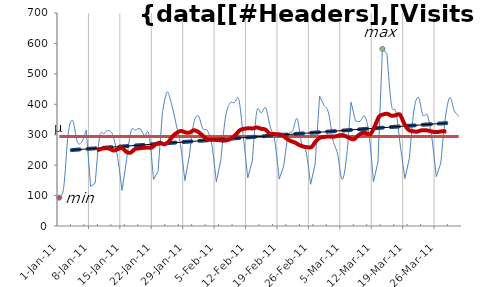
| Category | Visits | μ |
|---|---|---|
| 2011-01-01 | 93 | 293.9 |
| 2011-01-02 | 127 | 293.9 |
| 2011-01-03 | 304 | 293.9 |
| 2011-01-04 | 347 | 293.9 |
| 2011-01-05 | 277 | 293.9 |
| 2011-01-06 | 275 | 293.9 |
| 2011-01-07 | 315 | 293.9 |
| 2011-01-08 | 130 | 293.9 |
| 2011-01-09 | 141 | 293.9 |
| 2011-01-10 | 293 | 293.9 |
| 2011-01-11 | 304 | 293.9 |
| 2011-01-12 | 314 | 293.9 |
| 2011-01-13 | 296 | 293.9 |
| 2011-01-14 | 225 | 293.9 |
| 2011-01-15 | 117 | 293.9 |
| 2011-01-16 | 218 | 293.9 |
| 2011-01-17 | 313 | 293.9 |
| 2011-01-18 | 315 | 293.9 |
| 2011-01-19 | 320 | 293.9 |
| 2011-01-20 | 297 | 293.9 |
| 2011-01-21 | 301 | 293.9 |
| 2011-01-22 | 153 | 293.9 |
| 2011-01-23 | 179 | 293.9 |
| 2011-01-24 | 375 | 293.9 |
| 2011-01-25 | 440 | 293.9 |
| 2011-01-26 | 402 | 293.9 |
| 2011-01-27 | 337 | 293.9 |
| 2011-01-28 | 267 | 293.9 |
| 2011-01-29 | 149 | 293.9 |
| 2011-01-30 | 233 | 293.9 |
| 2011-01-31 | 340 | 293.9 |
| 2011-02-01 | 361 | 293.9 |
| 2011-02-02 | 319 | 293.9 |
| 2011-02-03 | 314 | 293.9 |
| 2011-02-04 | 266 | 293.9 |
| 2011-02-05 | 145 | 293.9 |
| 2011-02-06 | 218 | 293.9 |
| 2011-02-07 | 354 | 293.9 |
| 2011-02-08 | 403 | 293.9 |
| 2011-02-09 | 405 | 293.9 |
| 2011-02-10 | 416 | 293.9 |
| 2011-02-11 | 295 | 293.9 |
| 2011-02-12 | 158 | 293.9 |
| 2011-02-13 | 214 | 293.9 |
| 2011-02-14 | 376 | 293.9 |
| 2011-02-15 | 372 | 293.9 |
| 2011-02-16 | 388 | 293.9 |
| 2011-02-17 | 326 | 293.9 |
| 2011-02-18 | 281 | 293.9 |
| 2011-02-19 | 154 | 293.9 |
| 2011-02-20 | 197 | 293.9 |
| 2011-02-21 | 297 | 293.9 |
| 2011-02-22 | 313 | 293.9 |
| 2011-02-23 | 353 | 293.9 |
| 2011-02-24 | 272 | 293.9 |
| 2011-02-25 | 243 | 293.9 |
| 2011-02-26 | 137 | 293.9 |
| 2011-02-27 | 203 | 293.9 |
| 2011-02-28 | 427 | 293.9 |
| 2011-03-01 | 396 | 293.9 |
| 2011-03-02 | 371 | 293.9 |
| 2011-03-03 | 282 | 293.9 |
| 2011-03-04 | 237 | 293.9 |
| 2011-03-05 | 153 | 293.9 |
| 2011-03-06 | 226 | 293.9 |
| 2011-03-07 | 407 | 293.9 |
| 2011-03-08 | 345 | 293.9 |
| 2011-03-09 | 344 | 293.9 |
| 2011-03-10 | 361 | 293.9 |
| 2011-03-11 | 305 | 293.9 |
| 2011-03-12 | 145 | 293.9 |
| 2011-03-13 | 210 | 293.9 |
| 2011-03-14 | 582 | 293.9 |
| 2011-03-15 | 566 | 293.9 |
| 2011-03-16 | 397 | 293.9 |
| 2011-03-17 | 375 | 293.9 |
| 2011-03-18 | 262 | 293.9 |
| 2011-03-19 | 156 | 293.9 |
| 2011-03-20 | 223 | 293.9 |
| 2011-03-21 | 378 | 293.9 |
| 2011-03-22 | 423 | 293.9 |
| 2011-03-23 | 364 | 293.9 |
| 2011-03-24 | 364 | 293.9 |
| 2011-03-25 | 290 | 293.9 |
| 2011-03-26 | 162 | 293.9 |
| 2011-03-27 | 207 | 293.9 |
| 2011-03-28 | 354 | 293.9 |
| 2011-03-29 | 422 | 293.9 |
| 2011-03-30 | 379 | 293.9 |
| 2011-03-31 | 361 | 293.9 |